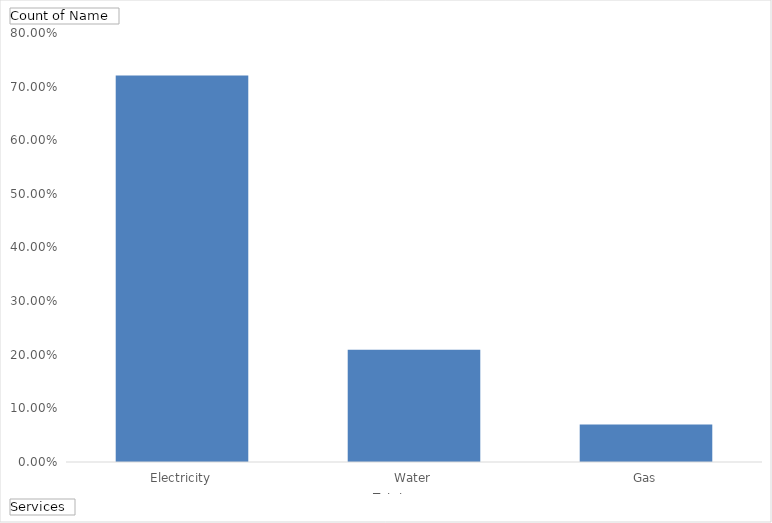
| Category | Total |
|---|---|
| Electricity | 0.721 |
| Water | 0.209 |
| Gas | 0.07 |